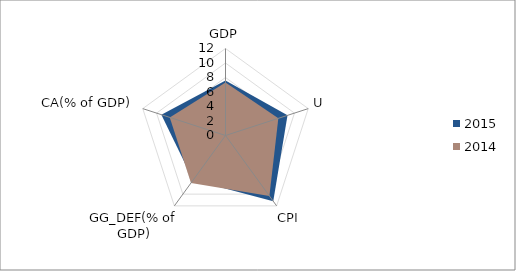
| Category | 2015 | 2014 |
|---|---|---|
| GDP | 7.6 | 7.3 |
| U | 8.996 | 7.663 |
| CPI | 11.2 | 10.299 |
| GG_DEF(% of GDP) | 7.6 | 8.091 |
| CA(% of GDP) | 9.3 | 8.082 |